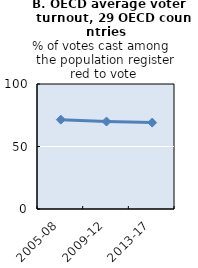
| Category | Voter turnout (OECD 29) |
|---|---|
| 2005-08 | 71.484 |
| 2009-12 | 69.979 |
| 2013-17 | 69.126 |